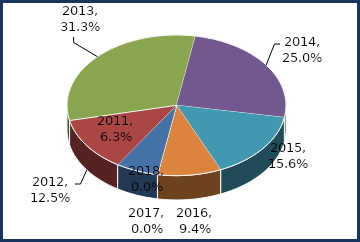
| Category | Series 1 |
|---|---|
| 2011.0 | 0.062 |
| 2012.0 | 0.125 |
| 2013.0 | 0.312 |
| 2014.0 | 0.25 |
| 2015.0 | 0.156 |
| 2016.0 | 0.094 |
| 2017.0 | 0 |
| 2018.0 | 0 |